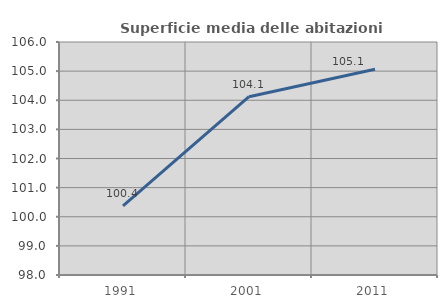
| Category | Superficie media delle abitazioni occupate |
|---|---|
| 1991.0 | 100.377 |
| 2001.0 | 104.123 |
| 2011.0 | 105.062 |